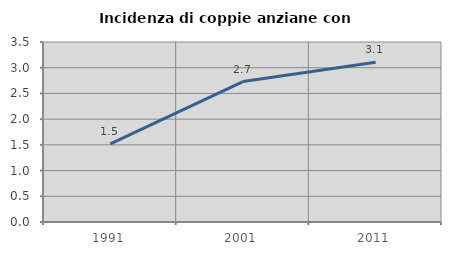
| Category | Incidenza di coppie anziane con figli |
|---|---|
| 1991.0 | 1.521 |
| 2001.0 | 2.73 |
| 2011.0 | 3.106 |